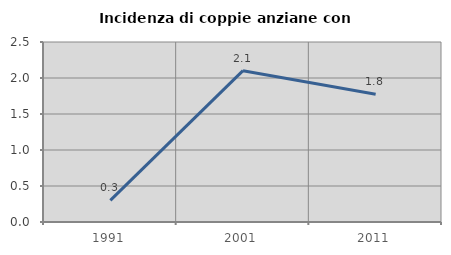
| Category | Incidenza di coppie anziane con figli |
|---|---|
| 1991.0 | 0.3 |
| 2001.0 | 2.102 |
| 2011.0 | 1.775 |